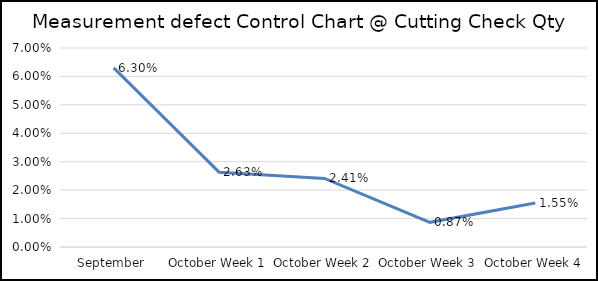
| Category | MMTS defect % |
|---|---|
| September | 0.063 |
| October Week 1 | 0.026 |
| October Week 2 | 0.024 |
| October Week 3 | 0.009 |
| October Week 4 | 0.015 |